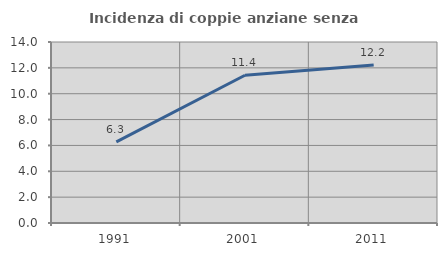
| Category | Incidenza di coppie anziane senza figli  |
|---|---|
| 1991.0 | 6.271 |
| 2001.0 | 11.429 |
| 2011.0 | 12.219 |